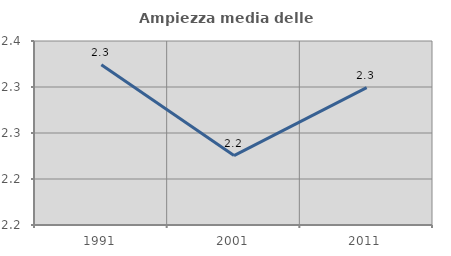
| Category | Ampiezza media delle famiglie |
|---|---|
| 1991.0 | 2.324 |
| 2001.0 | 2.225 |
| 2011.0 | 2.299 |